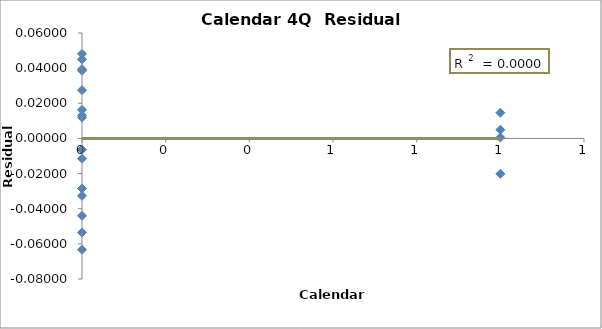
| Category | Series 0 |
|---|---|
| 0.0 | -0.033 |
| 0.0 | -0.012 |
| 0.0 | 0.048 |
| 1.0 | 0.015 |
| 0.0 | -0.063 |
| 0.0 | -0.006 |
| 0.0 | 0.045 |
| 1.0 | 0.005 |
| 0.0 | -0.044 |
| 0.0 | 0.016 |
| 0.0 | 0.039 |
| 1.0 | -0.02 |
| 0.0 | -0.054 |
| 0.0 | 0.012 |
| 0.0 | 0.027 |
| 1.0 | 0.001 |
| 0.0 | -0.029 |
| 0.0 | 0.013 |
| 0.0 | 0.039 |